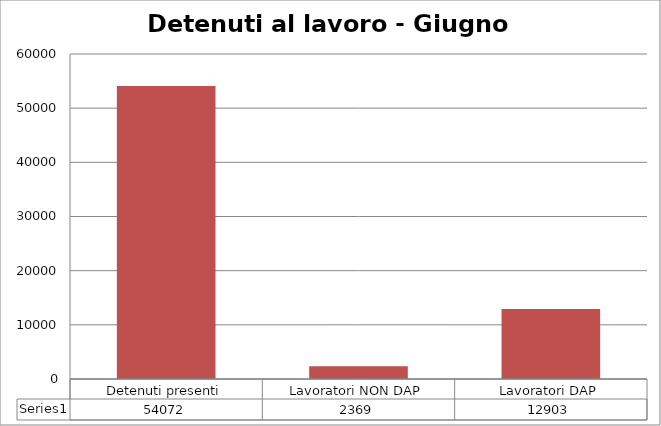
| Category | Series 0 |
|---|---|
| Detenuti presenti | 54072 |
| Lavoratori NON DAP | 2369 |
| Lavoratori DAP | 12903 |